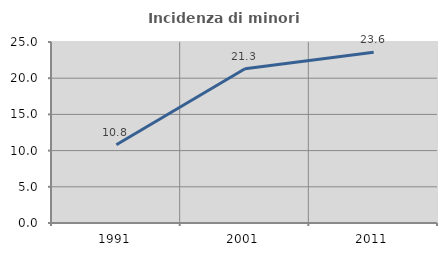
| Category | Incidenza di minori stranieri |
|---|---|
| 1991.0 | 10.811 |
| 2001.0 | 21.311 |
| 2011.0 | 23.582 |